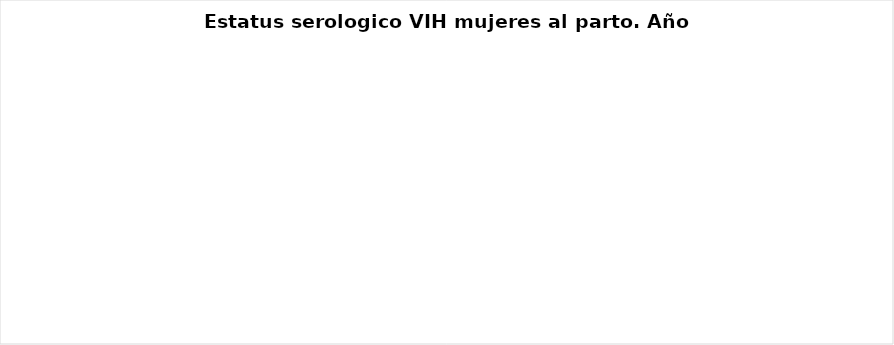
| Category | <15 años | 15 a 24 años | >25 años |
|---|---|---|---|
| VIH (+) conocida previa | 0 | 0 | 0 |
| VIH (+) conocida en este embarazo | 0 | 0 | 0 |
| Resultado (+) durante el parto | 0 | 0 | 0 |
| VIH (-) al parto | 0 | 0 | 0 |